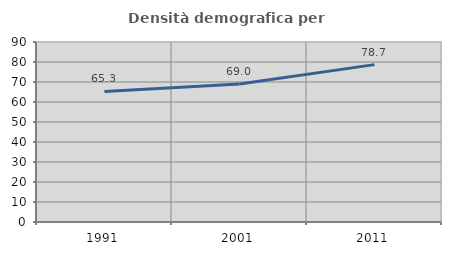
| Category | Densità demografica |
|---|---|
| 1991.0 | 65.265 |
| 2001.0 | 69.044 |
| 2011.0 | 78.686 |